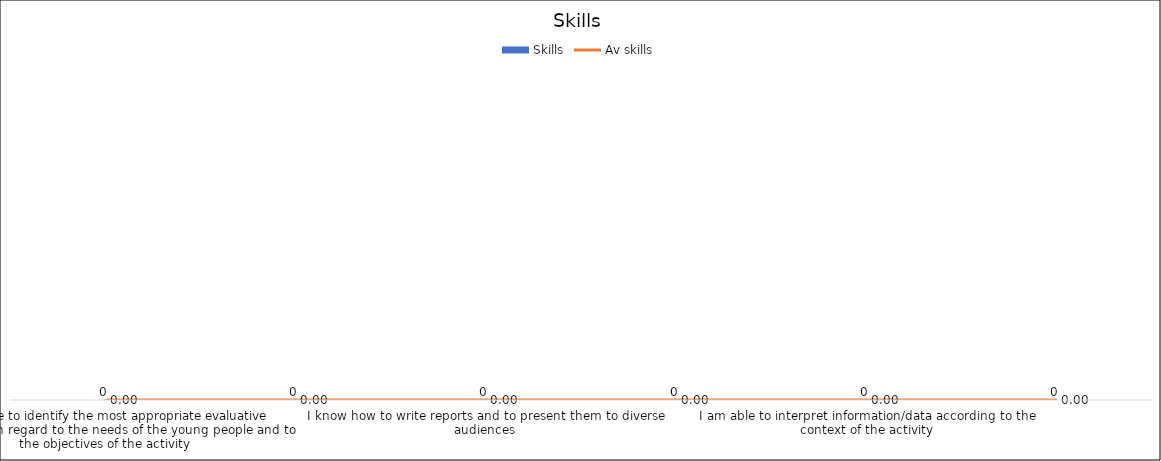
| Category | Skills |
|---|---|
| I am  able to identify the most appropriate evaluative approach with regard to the needs of the young people and to the objectives of the activity | 0 |
| I know how to ensure that the impact assessment of the young people’s needs suit the objectives identified | 0 |
| I know how to write reports and to present them to diverse audiences | 0 |
| I am able to work with both quantitative and qualitative information/data | 0 |
| I am able to interpret information/data according to the context of the activity | 0 |
| I am able to plan an experience’s follow-up while taking into account the outcomes of the programme/project | 0 |